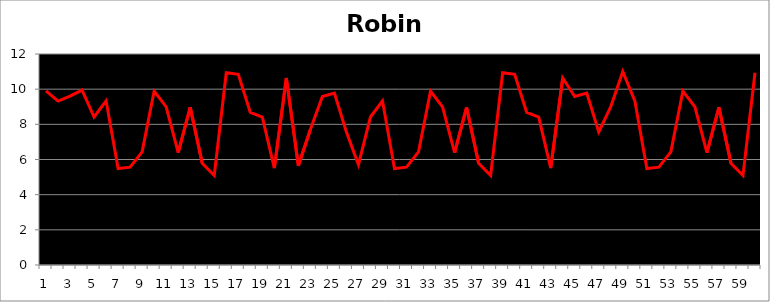
| Category | Robin |
|---|---|
| 0 | 9.902 |
| 1 | 9.322 |
| 2 | 9.6 |
| 3 | 9.944 |
| 4 | 8.417 |
| 5 | 9.337 |
| 6 | 5.489 |
| 7 | 5.565 |
| 8 | 6.432 |
| 9 | 9.893 |
| 10 | 8.993 |
| 11 | 6.393 |
| 12 | 8.961 |
| 13 | 5.791 |
| 14 | 5.09 |
| 15 | 10.935 |
| 16 | 10.843 |
| 17 | 8.674 |
| 18 | 8.41 |
| 19 | 5.507 |
| 20 | 10.637 |
| 21 | 5.641 |
| 22 | 7.706 |
| 23 | 9.586 |
| 24 | 9.777 |
| 25 | 7.569 |
| 26 | 5.705 |
| 27 | 8.417 |
| 28 | 9.337 |
| 29 | 5.489 |
| 30 | 5.565 |
| 31 | 6.432 |
| 32 | 9.893 |
| 33 | 8.993 |
| 34 | 6.393 |
| 35 | 8.961 |
| 36 | 5.791 |
| 37 | 5.09 |
| 38 | 10.935 |
| 39 | 10.843 |
| 40 | 8.674 |
| 41 | 8.41 |
| 42 | 5.507 |
| 43 | 10.637 |
| 44 | 9.586 |
| 45 | 9.777 |
| 46 | 7.569 |
| 47 | 9 |
| 48 | 11 |
| 49 | 9.337 |
| 50 | 5.489 |
| 51 | 5.565 |
| 52 | 6.432 |
| 53 | 9.893 |
| 54 | 8.993 |
| 55 | 6.393 |
| 56 | 8.961 |
| 57 | 5.791 |
| 58 | 5.09 |
| 59 | 10.935 |